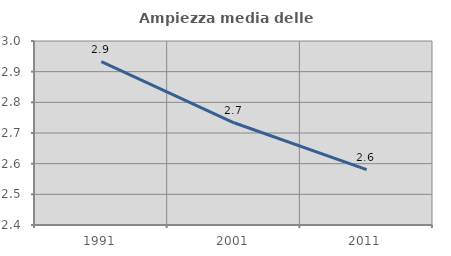
| Category | Ampiezza media delle famiglie |
|---|---|
| 1991.0 | 2.933 |
| 2001.0 | 2.733 |
| 2011.0 | 2.581 |